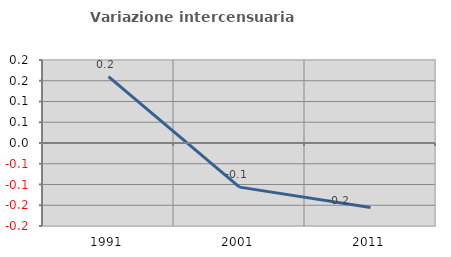
| Category | Variazione intercensuaria annua |
|---|---|
| 1991.0 | 0.16 |
| 2001.0 | -0.106 |
| 2011.0 | -0.156 |